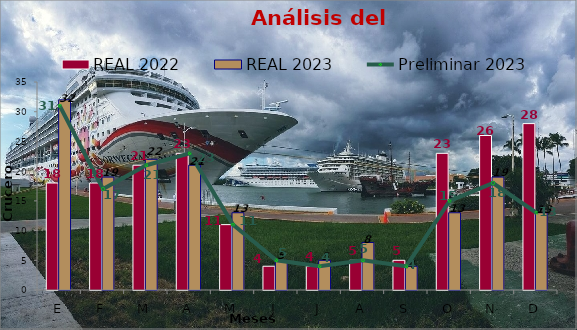
| Category | REAL 2022 | REAL 2023 |
|---|---|---|
| E | 18 | 32 |
| F | 18 | 19 |
| M | 21 | 22 |
| A | 23 | 21 |
| M | 11 | 13 |
| J | 4 | 5 |
| J | 4 | 5 |
| A | 5 | 8 |
| S | 5 | 4 |
| O | 23 | 13 |
| N | 26 | 19 |
| D | 28 | 13 |